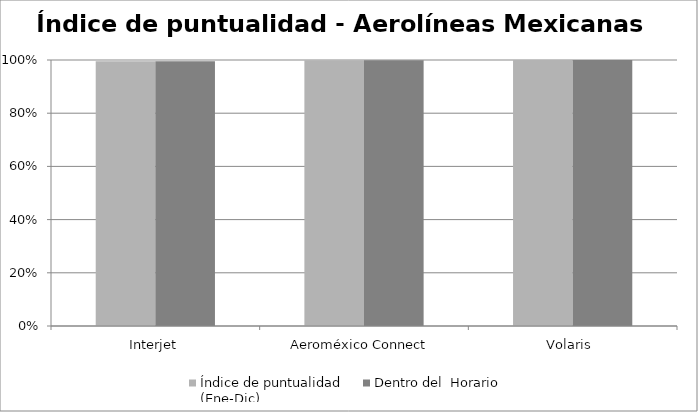
| Category | Índice de puntualidad
(Ene-Dic) | Dentro del  Horario |
|---|---|---|
| Interjet | 0.995 | 0.995 |
| Aeroméxico Connect  | 0.999 | 0.999 |
| Volaris  | 1 | 1 |